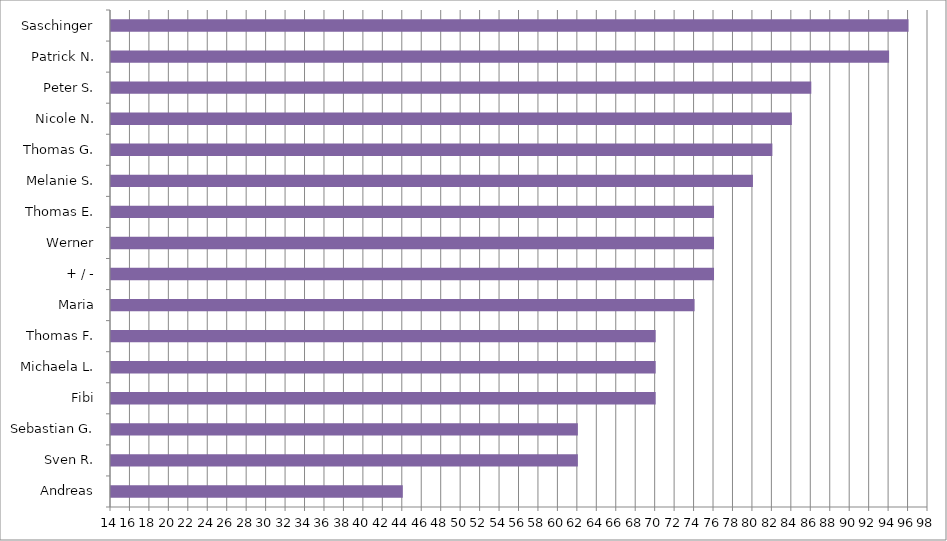
| Category | Series 0 |
|---|---|
| Andreas | 44 |
| Sven R. | 62 |
| Sebastian G. | 62 |
| Fibi | 70 |
| Michaela L. | 70 |
| Thomas F. | 70 |
| Maria | 74 |
| + / - | 76 |
| Werner | 76 |
| Thomas E. | 76 |
| Melanie S. | 80 |
| Thomas G. | 82 |
| Nicole N. | 84 |
| Peter S. | 86 |
| Patrick N. | 94 |
| Saschinger | 96 |